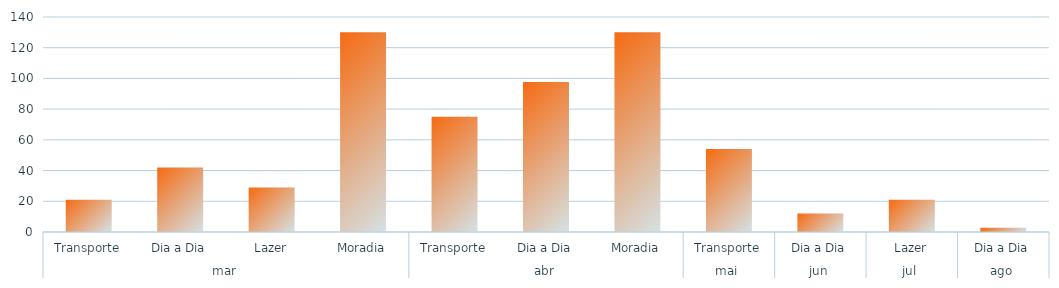
| Category | Total |
|---|---|
| 0 | 21 |
| 1 | 42 |
| 2 | 29 |
| 3 | 130 |
| 4 | 75 |
| 5 | 97.75 |
| 6 | 130 |
| 7 | 54 |
| 8 | 12 |
| 9 | 21 |
| 10 | 2.75 |